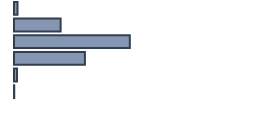
| Category | Percentatge |
|---|---|
| 0 | 1.415 |
| 1 | 19.427 |
| 2 | 48.258 |
| 3 | 29.546 |
| 4 | 1.25 |
| 5 | 0.104 |